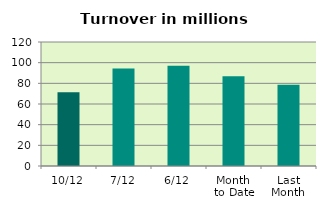
| Category | Series 0 |
|---|---|
| 10/12 | 71.26 |
| 7/12 | 94.364 |
| 6/12 | 96.994 |
| Month 
to Date | 86.964 |
| Last
Month | 78.658 |